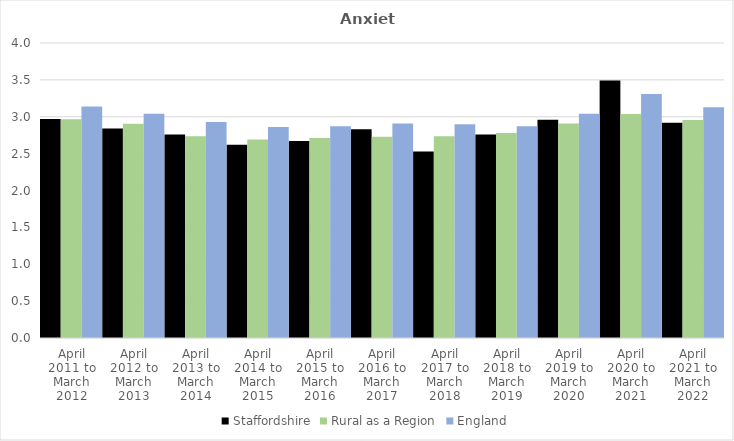
| Category | Staffordshire | Rural as a Region | England |
|---|---|---|---|
| April 2011 to March 2012 | 2.97 | 2.967 | 3.14 |
| April 2012 to March 2013 | 2.84 | 2.904 | 3.04 |
| April 2013 to March 2014 | 2.76 | 2.734 | 2.93 |
| April 2014 to March 2015 | 2.62 | 2.691 | 2.86 |
| April 2015 to March 2016 | 2.67 | 2.711 | 2.87 |
| April 2016 to March 2017 | 2.83 | 2.729 | 2.91 |
| April 2017 to March 2018 | 2.53 | 2.736 | 2.9 |
| April 2018 to March 2019 | 2.76 | 2.78 | 2.87 |
| April 2019 to March 2020 | 2.96 | 2.908 | 3.04 |
| April 2020 to March 2021 | 3.49 | 3.036 | 3.31 |
| April 2021 to March 2022 | 2.92 | 2.956 | 3.13 |